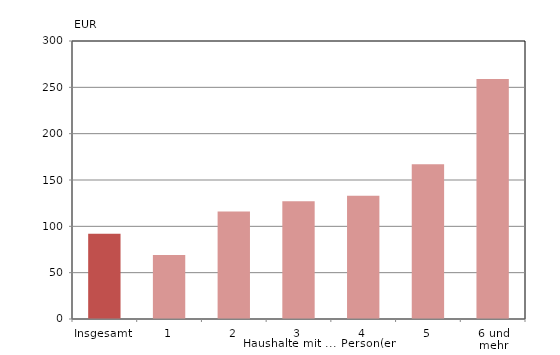
| Category | Series 0 |
|---|---|
| Insgesamt | 92 |
| 1 | 69 |
| 2 | 116 |
| 3 | 127 |
| 4 | 133 |
| 5 | 167 |
| 6 und mehr | 259 |